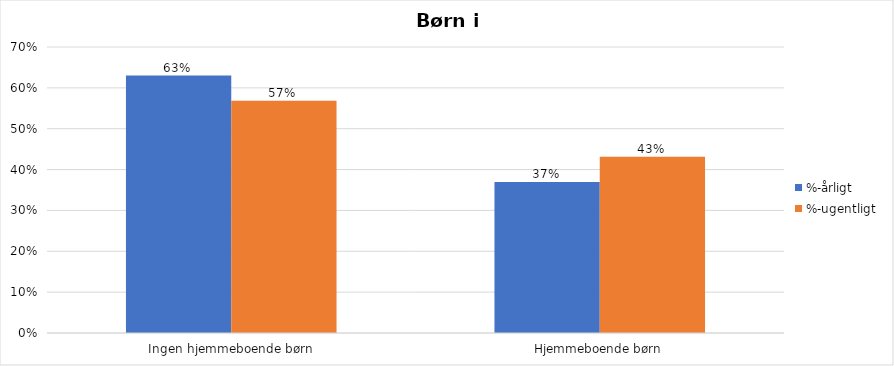
| Category | %-årligt | %-ugentligt |
|---|---|---|
| Ingen hjemmeboende børn | 0.63 | 0.568 |
| Hjemmeboende børn | 0.37 | 0.432 |